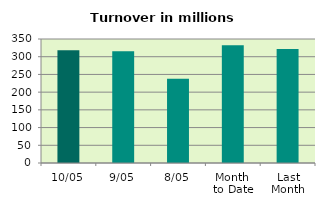
| Category | Series 0 |
|---|---|
| 10/05 | 318.376 |
| 9/05 | 315.65 |
| 8/05 | 237.892 |
| Month 
to Date | 332.302 |
| Last
Month | 322.024 |